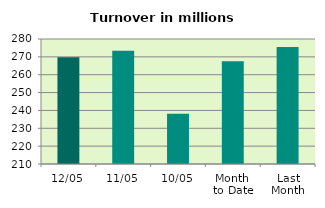
| Category | Series 0 |
|---|---|
| 12/05 | 269.806 |
| 11/05 | 273.463 |
| 10/05 | 238.091 |
| Month 
to Date | 267.512 |
| Last
Month | 275.481 |